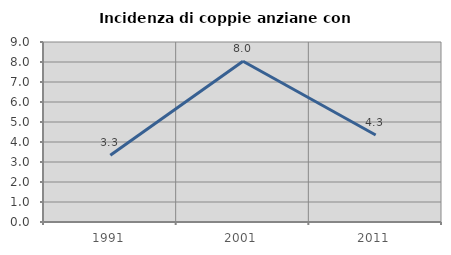
| Category | Incidenza di coppie anziane con figli |
|---|---|
| 1991.0 | 3.333 |
| 2001.0 | 8.04 |
| 2011.0 | 4.348 |